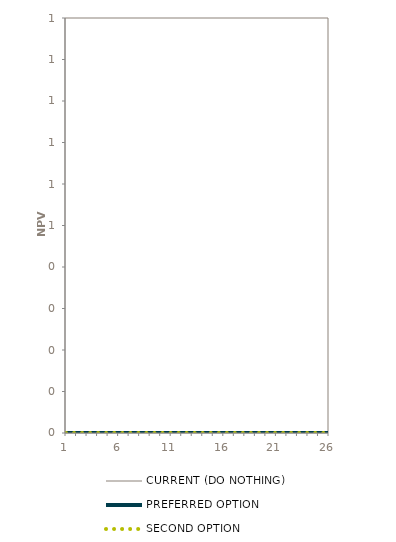
| Category | CURRENT (DO NOTHING) | PREFERRED OPTION | SECOND OPTION |
|---|---|---|---|
| 1.0 | 0 | 0 | 0 |
| 2.0 | 0 | 0 | 0 |
| 3.0 | 0 | 0 | 0 |
| 4.0 | 0 | 0 | 0 |
| 5.0 | 0 | 0 | 0 |
| 6.0 | 0 | 0 | 0 |
| 7.0 | 0 | 0 | 0 |
| 8.0 | 0 | 0 | 0 |
| 9.0 | 0 | 0 | 0 |
| 10.0 | 0 | 0 | 0 |
| 11.0 | 0 | 0 | 0 |
| 12.0 | 0 | 0 | 0 |
| 13.0 | 0 | 0 | 0 |
| 14.0 | 0 | 0 | 0 |
| 15.0 | 0 | 0 | 0 |
| 16.0 | 0 | 0 | 0 |
| 17.0 | 0 | 0 | 0 |
| 18.0 | 0 | 0 | 0 |
| 19.0 | 0 | 0 | 0 |
| 20.0 | 0 | 0 | 0 |
| 21.0 | 0 | 0 | 0 |
| 22.0 | 0 | 0 | 0 |
| 23.0 | 0 | 0 | 0 |
| 24.0 | 0 | 0 | 0 |
| 25.0 | 0 | 0 | 0 |
| 26.0 | 0 | 0 | 0 |